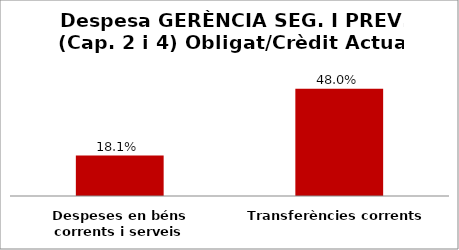
| Category | Series 0 |
|---|---|
| Despeses en béns corrents i serveis | 0.181 |
| Transferències corrents | 0.48 |